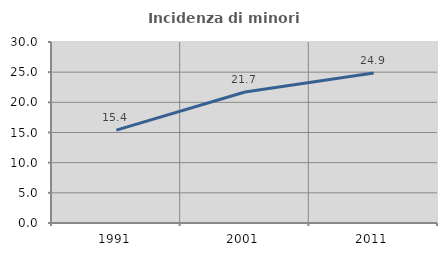
| Category | Incidenza di minori stranieri |
|---|---|
| 1991.0 | 15.385 |
| 2001.0 | 21.705 |
| 2011.0 | 24.859 |